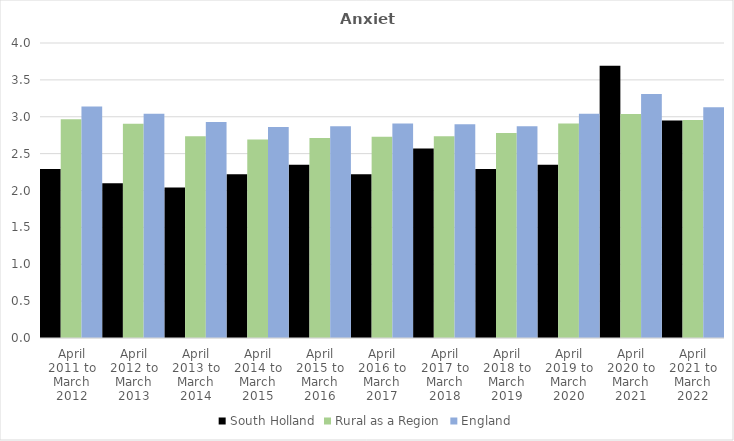
| Category | South Holland | Rural as a Region | England |
|---|---|---|---|
| April 2011 to March 2012 | 2.29 | 2.967 | 3.14 |
| April 2012 to March 2013 | 2.1 | 2.904 | 3.04 |
| April 2013 to March 2014 | 2.04 | 2.734 | 2.93 |
| April 2014 to March 2015 | 2.22 | 2.691 | 2.86 |
| April 2015 to March 2016 | 2.35 | 2.711 | 2.87 |
| April 2016 to March 2017 | 2.22 | 2.729 | 2.91 |
| April 2017 to March 2018 | 2.57 | 2.736 | 2.9 |
| April 2018 to March 2019 | 2.29 | 2.78 | 2.87 |
| April 2019 to March 2020 | 2.35 | 2.908 | 3.04 |
| April 2020 to March 2021 | 3.69 | 3.036 | 3.31 |
| April 2021 to March 2022 | 2.95 | 2.956 | 3.13 |